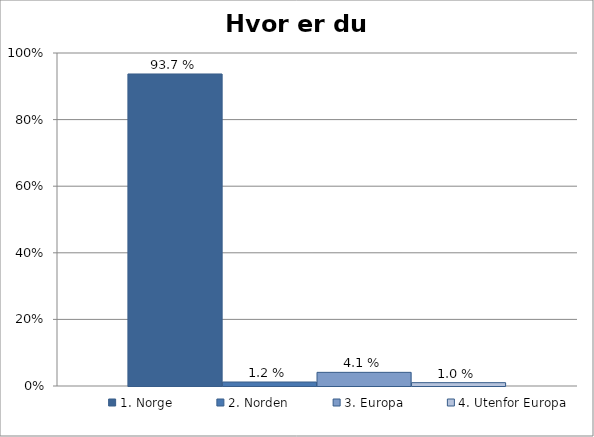
| Category | 1. Norge | 2. Norden | 3. Europa | 4. Utenfor Europa |
|---|---|---|---|---|
| Hvor er du født? | 0.937 | 0.012 | 0.041 | 0.01 |